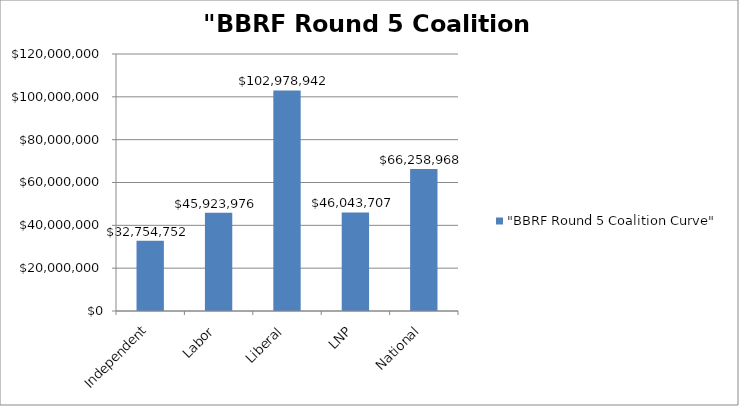
| Category | "BBRF Round 5 Coalition Curve" |
|---|---|
| Independent | 32754752 |
| Labor | 45923976 |
| Liberal | 102978942 |
| LNP | 46043707 |
| National | 66258968 |